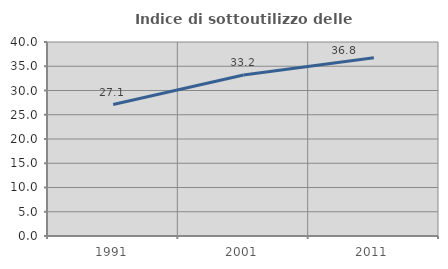
| Category | Indice di sottoutilizzo delle abitazioni  |
|---|---|
| 1991.0 | 27.107 |
| 2001.0 | 33.194 |
| 2011.0 | 36.755 |